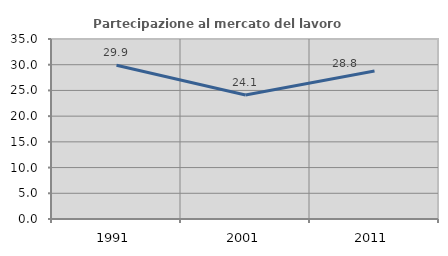
| Category | Partecipazione al mercato del lavoro  femminile |
|---|---|
| 1991.0 | 29.88 |
| 2001.0 | 24.123 |
| 2011.0 | 28.797 |